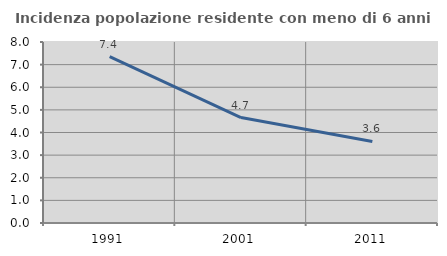
| Category | Incidenza popolazione residente con meno di 6 anni |
|---|---|
| 1991.0 | 7.356 |
| 2001.0 | 4.661 |
| 2011.0 | 3.605 |